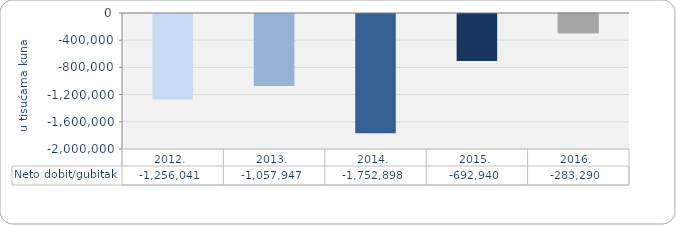
| Category | Neto dobit/gubitak |
|---|---|
| 2012. | -1256041 |
| 2013. | -1057947 |
| 2014. | -1752898 |
| 2015. | -692940 |
| 2016. | -283290 |